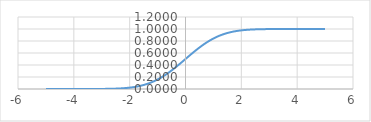
| Category | Series 0 |
|---|---|
| -5.0 | 0 |
| -4.9 | 0 |
| -4.8 | 0 |
| -4.7 | 0 |
| -4.6 | 0 |
| -4.5 | 0 |
| -4.4 | 0 |
| -4.3 | 0 |
| -4.2 | 0 |
| -4.1 | 0 |
| -4.0 | 0 |
| -3.9 | 0 |
| -3.8 | 0 |
| -3.7 | 0 |
| -3.6 | 0 |
| -3.50000000000001 | 0 |
| -3.40000000000001 | 0 |
| -3.30000000000001 | 0 |
| -3.20000000000001 | 0.001 |
| -3.10000000000001 | 0.001 |
| -3.00000000000001 | 0.001 |
| -2.90000000000001 | 0.002 |
| -2.80000000000001 | 0.003 |
| -2.70000000000001 | 0.003 |
| -2.60000000000001 | 0.005 |
| -2.50000000000001 | 0.006 |
| -2.40000000000001 | 0.008 |
| -2.30000000000001 | 0.011 |
| -2.20000000000001 | 0.014 |
| -2.10000000000001 | 0.018 |
| -2.00000000000001 | 0.023 |
| -1.90000000000001 | 0.029 |
| -1.80000000000001 | 0.036 |
| -1.70000000000001 | 0.045 |
| -1.60000000000001 | 0.055 |
| -1.50000000000001 | 0.067 |
| -1.40000000000001 | 0.081 |
| -1.30000000000001 | 0.097 |
| -1.20000000000001 | 0.115 |
| -1.10000000000001 | 0.136 |
| -1.00000000000001 | 0.159 |
| -0.90000000000001 | 0.184 |
| -0.80000000000001 | 0.212 |
| -0.70000000000002 | 0.242 |
| -0.60000000000002 | 0.274 |
| -0.50000000000002 | 0.309 |
| -0.40000000000002 | 0.345 |
| -0.30000000000002 | 0.382 |
| -0.20000000000002 | 0.421 |
| -0.10000000000002 | 0.46 |
| -2.04281036531029e-14 | 0.5 |
| 0.0999999999999801 | 0.54 |
| 0.19999999999998 | 0.579 |
| 0.29999999999998 | 0.618 |
| 0.39999999999998 | 0.655 |
| 0.49999999999998 | 0.691 |
| 0.59999999999998 | 0.726 |
| 0.69999999999998 | 0.758 |
| 0.79999999999998 | 0.788 |
| 0.89999999999998 | 0.816 |
| 0.99999999999998 | 0.841 |
| 1.09999999999998 | 0.864 |
| 1.19999999999998 | 0.885 |
| 1.29999999999998 | 0.903 |
| 1.39999999999998 | 0.919 |
| 1.49999999999998 | 0.933 |
| 1.59999999999998 | 0.945 |
| 1.69999999999998 | 0.955 |
| 1.79999999999998 | 0.964 |
| 1.89999999999998 | 0.971 |
| 1.99999999999998 | 0.977 |
| 2.09999999999997 | 0.982 |
| 2.19999999999997 | 0.986 |
| 2.29999999999997 | 0.989 |
| 2.39999999999997 | 0.992 |
| 2.49999999999997 | 0.994 |
| 2.59999999999997 | 0.995 |
| 2.69999999999997 | 0.997 |
| 2.79999999999997 | 0.997 |
| 2.89999999999997 | 0.998 |
| 2.99999999999997 | 0.999 |
| 3.09999999999997 | 0.999 |
| 3.19999999999997 | 0.999 |
| 3.29999999999997 | 1 |
| 3.39999999999997 | 1 |
| 3.49999999999997 | 1 |
| 3.59999999999997 | 1 |
| 3.69999999999997 | 1 |
| 3.79999999999997 | 1 |
| 3.89999999999997 | 1 |
| 3.99999999999997 | 1 |
| 4.09999999999997 | 1 |
| 4.19999999999997 | 1 |
| 4.29999999999997 | 1 |
| 4.39999999999997 | 1 |
| 4.49999999999997 | 1 |
| 4.59999999999997 | 1 |
| 4.69999999999997 | 1 |
| 4.79999999999997 | 1 |
| 4.89999999999996 | 1 |
| 4.99999999999996 | 1 |